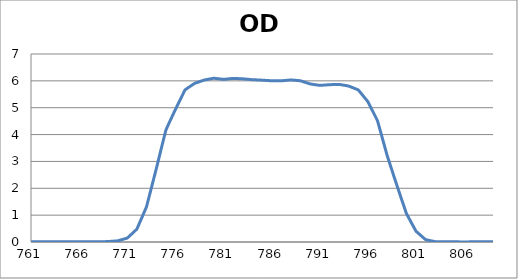
| Category | Series 0 |
|---|---|
| 2600.0 | 0.184 |
| 2599.0 | 0.183 |
| 2598.0 | 0.182 |
| 2597.0 | 0.182 |
| 2596.0 | 0.181 |
| 2595.0 | 0.18 |
| 2594.0 | 0.18 |
| 2593.0 | 0.18 |
| 2592.0 | 0.18 |
| 2591.0 | 0.18 |
| 2590.0 | 0.18 |
| 2589.0 | 0.18 |
| 2588.0 | 0.18 |
| 2587.0 | 0.181 |
| 2586.0 | 0.181 |
| 2585.0 | 0.182 |
| 2584.0 | 0.182 |
| 2583.0 | 0.182 |
| 2582.0 | 0.182 |
| 2581.0 | 0.182 |
| 2580.0 | 0.182 |
| 2579.0 | 0.181 |
| 2578.0 | 0.18 |
| 2577.0 | 0.18 |
| 2576.0 | 0.179 |
| 2575.0 | 0.178 |
| 2574.0 | 0.177 |
| 2573.0 | 0.175 |
| 2572.0 | 0.174 |
| 2571.0 | 0.172 |
| 2570.0 | 0.169 |
| 2569.0 | 0.167 |
| 2568.0 | 0.164 |
| 2567.0 | 0.161 |
| 2566.0 | 0.158 |
| 2565.0 | 0.155 |
| 2564.0 | 0.152 |
| 2563.0 | 0.149 |
| 2562.0 | 0.147 |
| 2561.0 | 0.145 |
| 2560.0 | 0.143 |
| 2559.0 | 0.141 |
| 2558.0 | 0.139 |
| 2557.0 | 0.138 |
| 2556.0 | 0.137 |
| 2555.0 | 0.137 |
| 2554.0 | 0.136 |
| 2553.0 | 0.136 |
| 2552.0 | 0.137 |
| 2551.0 | 0.138 |
| 2550.0 | 0.139 |
| 2549.0 | 0.141 |
| 2548.0 | 0.143 |
| 2547.0 | 0.145 |
| 2546.0 | 0.147 |
| 2545.0 | 0.15 |
| 2544.0 | 0.152 |
| 2543.0 | 0.155 |
| 2542.0 | 0.158 |
| 2541.0 | 0.161 |
| 2540.0 | 0.163 |
| 2539.0 | 0.166 |
| 2538.0 | 0.169 |
| 2537.0 | 0.171 |
| 2536.0 | 0.173 |
| 2535.0 | 0.175 |
| 2534.0 | 0.177 |
| 2533.0 | 0.178 |
| 2532.0 | 0.179 |
| 2531.0 | 0.18 |
| 2530.0 | 0.18 |
| 2529.0 | 0.18 |
| 2528.0 | 0.178 |
| 2527.0 | 0.177 |
| 2526.0 | 0.176 |
| 2525.0 | 0.174 |
| 2524.0 | 0.172 |
| 2523.0 | 0.169 |
| 2522.0 | 0.166 |
| 2521.0 | 0.163 |
| 2520.0 | 0.159 |
| 2519.0 | 0.155 |
| 2518.0 | 0.151 |
| 2517.0 | 0.147 |
| 2516.0 | 0.143 |
| 2515.0 | 0.139 |
| 2514.0 | 0.135 |
| 2513.0 | 0.132 |
| 2512.0 | 0.129 |
| 2511.0 | 0.126 |
| 2510.0 | 0.124 |
| 2509.0 | 0.122 |
| 2508.0 | 0.12 |
| 2507.0 | 0.119 |
| 2506.0 | 0.119 |
| 2505.0 | 0.119 |
| 2504.0 | 0.12 |
| 2503.0 | 0.121 |
| 2502.0 | 0.123 |
| 2501.0 | 0.125 |
| 2500.0 | 0.127 |
| 2499.0 | 0.13 |
| 2498.0 | 0.133 |
| 2497.0 | 0.137 |
| 2496.0 | 0.14 |
| 2495.0 | 0.144 |
| 2494.0 | 0.148 |
| 2493.0 | 0.151 |
| 2492.0 | 0.155 |
| 2491.0 | 0.159 |
| 2490.0 | 0.162 |
| 2489.0 | 0.164 |
| 2488.0 | 0.167 |
| 2487.0 | 0.17 |
| 2486.0 | 0.172 |
| 2485.0 | 0.173 |
| 2484.0 | 0.174 |
| 2483.0 | 0.175 |
| 2482.0 | 0.175 |
| 2481.0 | 0.175 |
| 2480.0 | 0.174 |
| 2479.0 | 0.173 |
| 2478.0 | 0.171 |
| 2477.0 | 0.169 |
| 2476.0 | 0.167 |
| 2475.0 | 0.164 |
| 2474.0 | 0.161 |
| 2473.0 | 0.157 |
| 2472.0 | 0.154 |
| 2471.0 | 0.15 |
| 2470.0 | 0.146 |
| 2469.0 | 0.143 |
| 2468.0 | 0.139 |
| 2467.0 | 0.135 |
| 2466.0 | 0.132 |
| 2465.0 | 0.128 |
| 2464.0 | 0.125 |
| 2463.0 | 0.122 |
| 2462.0 | 0.12 |
| 2461.0 | 0.118 |
| 2460.0 | 0.116 |
| 2459.0 | 0.115 |
| 2458.0 | 0.113 |
| 2457.0 | 0.113 |
| 2456.0 | 0.112 |
| 2455.0 | 0.112 |
| 2454.0 | 0.112 |
| 2453.0 | 0.113 |
| 2452.0 | 0.113 |
| 2451.0 | 0.114 |
| 2450.0 | 0.115 |
| 2449.0 | 0.116 |
| 2448.0 | 0.117 |
| 2447.0 | 0.118 |
| 2446.0 | 0.119 |
| 2445.0 | 0.12 |
| 2444.0 | 0.12 |
| 2443.0 | 0.121 |
| 2442.0 | 0.122 |
| 2441.0 | 0.123 |
| 2440.0 | 0.123 |
| 2439.0 | 0.124 |
| 2438.0 | 0.124 |
| 2437.0 | 0.124 |
| 2436.0 | 0.124 |
| 2435.0 | 0.124 |
| 2434.0 | 0.123 |
| 2433.0 | 0.123 |
| 2432.0 | 0.122 |
| 2431.0 | 0.121 |
| 2430.0 | 0.12 |
| 2429.0 | 0.12 |
| 2428.0 | 0.119 |
| 2427.0 | 0.118 |
| 2426.0 | 0.118 |
| 2425.0 | 0.117 |
| 2424.0 | 0.117 |
| 2423.0 | 0.117 |
| 2422.0 | 0.116 |
| 2421.0 | 0.116 |
| 2420.0 | 0.116 |
| 2419.0 | 0.116 |
| 2418.0 | 0.116 |
| 2417.0 | 0.116 |
| 2416.0 | 0.115 |
| 2415.0 | 0.115 |
| 2414.0 | 0.116 |
| 2413.0 | 0.116 |
| 2412.0 | 0.116 |
| 2411.0 | 0.116 |
| 2410.0 | 0.116 |
| 2409.0 | 0.116 |
| 2408.0 | 0.116 |
| 2407.0 | 0.116 |
| 2406.0 | 0.116 |
| 2405.0 | 0.116 |
| 2404.0 | 0.116 |
| 2403.0 | 0.116 |
| 2402.0 | 0.116 |
| 2401.0 | 0.116 |
| 2400.0 | 0.117 |
| 2399.0 | 0.117 |
| 2398.0 | 0.117 |
| 2397.0 | 0.118 |
| 2396.0 | 0.119 |
| 2395.0 | 0.12 |
| 2394.0 | 0.122 |
| 2393.0 | 0.123 |
| 2392.0 | 0.125 |
| 2391.0 | 0.127 |
| 2390.0 | 0.13 |
| 2389.0 | 0.132 |
| 2388.0 | 0.135 |
| 2387.0 | 0.139 |
| 2386.0 | 0.142 |
| 2385.0 | 0.145 |
| 2384.0 | 0.149 |
| 2383.0 | 0.152 |
| 2382.0 | 0.156 |
| 2381.0 | 0.159 |
| 2380.0 | 0.163 |
| 2379.0 | 0.166 |
| 2378.0 | 0.17 |
| 2377.0 | 0.172 |
| 2376.0 | 0.175 |
| 2375.0 | 0.177 |
| 2374.0 | 0.179 |
| 2373.0 | 0.181 |
| 2372.0 | 0.183 |
| 2371.0 | 0.184 |
| 2370.0 | 0.184 |
| 2369.0 | 0.184 |
| 2368.0 | 0.184 |
| 2367.0 | 0.183 |
| 2366.0 | 0.183 |
| 2365.0 | 0.181 |
| 2364.0 | 0.18 |
| 2363.0 | 0.178 |
| 2362.0 | 0.176 |
| 2361.0 | 0.174 |
| 2360.0 | 0.172 |
| 2359.0 | 0.169 |
| 2358.0 | 0.167 |
| 2357.0 | 0.165 |
| 2356.0 | 0.164 |
| 2355.0 | 0.162 |
| 2354.0 | 0.161 |
| 2353.0 | 0.16 |
| 2352.0 | 0.159 |
| 2351.0 | 0.159 |
| 2350.0 | 0.16 |
| 2349.0 | 0.16 |
| 2348.0 | 0.162 |
| 2347.0 | 0.163 |
| 2346.0 | 0.165 |
| 2345.0 | 0.167 |
| 2344.0 | 0.17 |
| 2343.0 | 0.173 |
| 2342.0 | 0.176 |
| 2341.0 | 0.179 |
| 2340.0 | 0.182 |
| 2339.0 | 0.185 |
| 2338.0 | 0.188 |
| 2337.0 | 0.191 |
| 2336.0 | 0.193 |
| 2335.0 | 0.196 |
| 2334.0 | 0.198 |
| 2333.0 | 0.2 |
| 2332.0 | 0.201 |
| 2331.0 | 0.202 |
| 2330.0 | 0.203 |
| 2329.0 | 0.203 |
| 2328.0 | 0.203 |
| 2327.0 | 0.203 |
| 2326.0 | 0.202 |
| 2325.0 | 0.201 |
| 2324.0 | 0.2 |
| 2323.0 | 0.198 |
| 2322.0 | 0.196 |
| 2321.0 | 0.194 |
| 2320.0 | 0.192 |
| 2319.0 | 0.19 |
| 2318.0 | 0.188 |
| 2317.0 | 0.186 |
| 2316.0 | 0.184 |
| 2315.0 | 0.183 |
| 2314.0 | 0.181 |
| 2313.0 | 0.18 |
| 2312.0 | 0.179 |
| 2311.0 | 0.178 |
| 2310.0 | 0.178 |
| 2309.0 | 0.178 |
| 2308.0 | 0.178 |
| 2307.0 | 0.179 |
| 2306.0 | 0.179 |
| 2305.0 | 0.18 |
| 2304.0 | 0.181 |
| 2303.0 | 0.182 |
| 2302.0 | 0.183 |
| 2301.0 | 0.184 |
| 2300.0 | 0.185 |
| 2299.0 | 0.186 |
| 2298.0 | 0.187 |
| 2297.0 | 0.187 |
| 2296.0 | 0.188 |
| 2295.0 | 0.188 |
| 2294.0 | 0.188 |
| 2293.0 | 0.188 |
| 2292.0 | 0.188 |
| 2291.0 | 0.188 |
| 2290.0 | 0.187 |
| 2289.0 | 0.187 |
| 2288.0 | 0.186 |
| 2287.0 | 0.186 |
| 2286.0 | 0.186 |
| 2285.0 | 0.186 |
| 2284.0 | 0.186 |
| 2283.0 | 0.186 |
| 2282.0 | 0.186 |
| 2281.0 | 0.187 |
| 2280.0 | 0.188 |
| 2279.0 | 0.19 |
| 2278.0 | 0.191 |
| 2277.0 | 0.193 |
| 2276.0 | 0.196 |
| 2275.0 | 0.198 |
| 2274.0 | 0.201 |
| 2273.0 | 0.204 |
| 2272.0 | 0.208 |
| 2271.0 | 0.211 |
| 2270.0 | 0.214 |
| 2269.0 | 0.217 |
| 2268.0 | 0.219 |
| 2267.0 | 0.222 |
| 2266.0 | 0.224 |
| 2265.0 | 0.226 |
| 2264.0 | 0.227 |
| 2263.0 | 0.228 |
| 2262.0 | 0.229 |
| 2261.0 | 0.229 |
| 2260.0 | 0.229 |
| 2259.0 | 0.229 |
| 2258.0 | 0.229 |
| 2257.0 | 0.228 |
| 2256.0 | 0.227 |
| 2255.0 | 0.226 |
| 2254.0 | 0.226 |
| 2253.0 | 0.226 |
| 2252.0 | 0.226 |
| 2251.0 | 0.226 |
| 2250.0 | 0.227 |
| 2249.0 | 0.228 |
| 2248.0 | 0.23 |
| 2247.0 | 0.232 |
| 2246.0 | 0.235 |
| 2245.0 | 0.239 |
| 2244.0 | 0.244 |
| 2243.0 | 0.249 |
| 2242.0 | 0.255 |
| 2241.0 | 0.261 |
| 2240.0 | 0.268 |
| 2239.0 | 0.275 |
| 2238.0 | 0.283 |
| 2237.0 | 0.29 |
| 2236.0 | 0.298 |
| 2235.0 | 0.305 |
| 2234.0 | 0.312 |
| 2233.0 | 0.318 |
| 2232.0 | 0.324 |
| 2231.0 | 0.329 |
| 2230.0 | 0.334 |
| 2229.0 | 0.337 |
| 2228.0 | 0.34 |
| 2227.0 | 0.342 |
| 2226.0 | 0.343 |
| 2225.0 | 0.344 |
| 2224.0 | 0.343 |
| 2223.0 | 0.342 |
| 2222.0 | 0.339 |
| 2221.0 | 0.336 |
| 2220.0 | 0.333 |
| 2219.0 | 0.329 |
| 2218.0 | 0.325 |
| 2217.0 | 0.321 |
| 2216.0 | 0.316 |
| 2215.0 | 0.312 |
| 2214.0 | 0.308 |
| 2213.0 | 0.304 |
| 2212.0 | 0.3 |
| 2211.0 | 0.297 |
| 2210.0 | 0.295 |
| 2209.0 | 0.293 |
| 2208.0 | 0.292 |
| 2207.0 | 0.291 |
| 2206.0 | 0.291 |
| 2205.0 | 0.291 |
| 2204.0 | 0.291 |
| 2203.0 | 0.293 |
| 2202.0 | 0.294 |
| 2201.0 | 0.296 |
| 2200.0 | 0.297 |
| 2199.0 | 0.299 |
| 2198.0 | 0.3 |
| 2197.0 | 0.301 |
| 2196.0 | 0.302 |
| 2195.0 | 0.302 |
| 2194.0 | 0.302 |
| 2193.0 | 0.302 |
| 2192.0 | 0.301 |
| 2191.0 | 0.3 |
| 2190.0 | 0.297 |
| 2189.0 | 0.295 |
| 2188.0 | 0.292 |
| 2187.0 | 0.288 |
| 2186.0 | 0.284 |
| 2185.0 | 0.28 |
| 2184.0 | 0.275 |
| 2183.0 | 0.27 |
| 2182.0 | 0.266 |
| 2181.0 | 0.261 |
| 2180.0 | 0.257 |
| 2179.0 | 0.253 |
| 2178.0 | 0.249 |
| 2177.0 | 0.245 |
| 2176.0 | 0.243 |
| 2175.0 | 0.241 |
| 2174.0 | 0.239 |
| 2173.0 | 0.238 |
| 2172.0 | 0.237 |
| 2171.0 | 0.238 |
| 2170.0 | 0.238 |
| 2169.0 | 0.239 |
| 2168.0 | 0.24 |
| 2167.0 | 0.241 |
| 2166.0 | 0.242 |
| 2165.0 | 0.244 |
| 2164.0 | 0.245 |
| 2163.0 | 0.246 |
| 2162.0 | 0.247 |
| 2161.0 | 0.247 |
| 2160.0 | 0.247 |
| 2159.0 | 0.247 |
| 2158.0 | 0.246 |
| 2157.0 | 0.245 |
| 2156.0 | 0.243 |
| 2155.0 | 0.241 |
| 2154.0 | 0.239 |
| 2153.0 | 0.237 |
| 2152.0 | 0.234 |
| 2151.0 | 0.232 |
| 2150.0 | 0.23 |
| 2149.0 | 0.228 |
| 2148.0 | 0.226 |
| 2147.0 | 0.225 |
| 2146.0 | 0.224 |
| 2145.0 | 0.224 |
| 2144.0 | 0.224 |
| 2143.0 | 0.225 |
| 2142.0 | 0.226 |
| 2141.0 | 0.228 |
| 2140.0 | 0.23 |
| 2139.0 | 0.232 |
| 2138.0 | 0.235 |
| 2137.0 | 0.237 |
| 2136.0 | 0.239 |
| 2135.0 | 0.242 |
| 2134.0 | 0.244 |
| 2133.0 | 0.245 |
| 2132.0 | 0.246 |
| 2131.0 | 0.247 |
| 2130.0 | 0.248 |
| 2129.0 | 0.248 |
| 2128.0 | 0.247 |
| 2127.0 | 0.246 |
| 2126.0 | 0.245 |
| 2125.0 | 0.244 |
| 2124.0 | 0.242 |
| 2123.0 | 0.24 |
| 2122.0 | 0.239 |
| 2121.0 | 0.237 |
| 2120.0 | 0.237 |
| 2119.0 | 0.236 |
| 2118.0 | 0.237 |
| 2117.0 | 0.238 |
| 2116.0 | 0.24 |
| 2115.0 | 0.243 |
| 2114.0 | 0.247 |
| 2113.0 | 0.252 |
| 2112.0 | 0.258 |
| 2111.0 | 0.264 |
| 2110.0 | 0.271 |
| 2109.0 | 0.278 |
| 2108.0 | 0.286 |
| 2107.0 | 0.294 |
| 2106.0 | 0.301 |
| 2105.0 | 0.308 |
| 2104.0 | 0.315 |
| 2103.0 | 0.321 |
| 2102.0 | 0.326 |
| 2101.0 | 0.33 |
| 2100.0 | 0.334 |
| 2099.0 | 0.336 |
| 2098.0 | 0.337 |
| 2097.0 | 0.337 |
| 2096.0 | 0.337 |
| 2095.0 | 0.336 |
| 2094.0 | 0.334 |
| 2093.0 | 0.331 |
| 2092.0 | 0.328 |
| 2091.0 | 0.324 |
| 2090.0 | 0.32 |
| 2089.0 | 0.317 |
| 2088.0 | 0.314 |
| 2087.0 | 0.311 |
| 2086.0 | 0.308 |
| 2085.0 | 0.307 |
| 2084.0 | 0.306 |
| 2083.0 | 0.306 |
| 2082.0 | 0.308 |
| 2081.0 | 0.31 |
| 2080.0 | 0.313 |
| 2079.0 | 0.317 |
| 2078.0 | 0.322 |
| 2077.0 | 0.327 |
| 2076.0 | 0.333 |
| 2075.0 | 0.339 |
| 2074.0 | 0.346 |
| 2073.0 | 0.352 |
| 2072.0 | 0.358 |
| 2071.0 | 0.363 |
| 2070.0 | 0.368 |
| 2069.0 | 0.373 |
| 2068.0 | 0.376 |
| 2067.0 | 0.379 |
| 2066.0 | 0.381 |
| 2065.0 | 0.382 |
| 2064.0 | 0.383 |
| 2063.0 | 0.383 |
| 2062.0 | 0.383 |
| 2061.0 | 0.381 |
| 2060.0 | 0.38 |
| 2059.0 | 0.379 |
| 2058.0 | 0.378 |
| 2057.0 | 0.376 |
| 2056.0 | 0.375 |
| 2055.0 | 0.374 |
| 2054.0 | 0.373 |
| 2053.0 | 0.373 |
| 2052.0 | 0.373 |
| 2051.0 | 0.373 |
| 2050.0 | 0.374 |
| 2049.0 | 0.375 |
| 2048.0 | 0.376 |
| 2047.0 | 0.377 |
| 2046.0 | 0.377 |
| 2045.0 | 0.378 |
| 2044.0 | 0.379 |
| 2043.0 | 0.379 |
| 2042.0 | 0.379 |
| 2041.0 | 0.378 |
| 2040.0 | 0.377 |
| 2039.0 | 0.375 |
| 2038.0 | 0.372 |
| 2037.0 | 0.368 |
| 2036.0 | 0.364 |
| 2035.0 | 0.36 |
| 2034.0 | 0.356 |
| 2033.0 | 0.351 |
| 2032.0 | 0.346 |
| 2031.0 | 0.341 |
| 2030.0 | 0.337 |
| 2029.0 | 0.332 |
| 2028.0 | 0.329 |
| 2027.0 | 0.327 |
| 2026.0 | 0.325 |
| 2025.0 | 0.324 |
| 2024.0 | 0.324 |
| 2023.0 | 0.325 |
| 2022.0 | 0.326 |
| 2021.0 | 0.329 |
| 2020.0 | 0.331 |
| 2019.0 | 0.334 |
| 2018.0 | 0.337 |
| 2017.0 | 0.34 |
| 2016.0 | 0.342 |
| 2015.0 | 0.344 |
| 2014.0 | 0.345 |
| 2013.0 | 0.346 |
| 2012.0 | 0.346 |
| 2011.0 | 0.345 |
| 2010.0 | 0.343 |
| 2009.0 | 0.341 |
| 2008.0 | 0.338 |
| 2007.0 | 0.333 |
| 2006.0 | 0.329 |
| 2005.0 | 0.323 |
| 2004.0 | 0.318 |
| 2003.0 | 0.312 |
| 2002.0 | 0.307 |
| 2001.0 | 0.301 |
| 2000.0 | 0.297 |
| 1999.0 | 0.293 |
| 1998.0 | 0.289 |
| 1997.0 | 0.287 |
| 1996.0 | 0.286 |
| 1995.0 | 0.287 |
| 1994.0 | 0.288 |
| 1993.0 | 0.29 |
| 1992.0 | 0.292 |
| 1991.0 | 0.295 |
| 1990.0 | 0.299 |
| 1989.0 | 0.302 |
| 1988.0 | 0.305 |
| 1987.0 | 0.308 |
| 1986.0 | 0.311 |
| 1985.0 | 0.313 |
| 1984.0 | 0.313 |
| 1983.0 | 0.314 |
| 1982.0 | 0.313 |
| 1981.0 | 0.311 |
| 1980.0 | 0.309 |
| 1979.0 | 0.306 |
| 1978.0 | 0.302 |
| 1977.0 | 0.298 |
| 1976.0 | 0.294 |
| 1975.0 | 0.29 |
| 1974.0 | 0.287 |
| 1973.0 | 0.284 |
| 1972.0 | 0.282 |
| 1971.0 | 0.28 |
| 1970.0 | 0.279 |
| 1969.0 | 0.28 |
| 1968.0 | 0.281 |
| 1967.0 | 0.283 |
| 1966.0 | 0.286 |
| 1965.0 | 0.289 |
| 1964.0 | 0.293 |
| 1963.0 | 0.297 |
| 1962.0 | 0.301 |
| 1961.0 | 0.306 |
| 1960.0 | 0.31 |
| 1959.0 | 0.313 |
| 1958.0 | 0.316 |
| 1957.0 | 0.318 |
| 1956.0 | 0.319 |
| 1955.0 | 0.319 |
| 1954.0 | 0.319 |
| 1953.0 | 0.318 |
| 1952.0 | 0.317 |
| 1951.0 | 0.315 |
| 1950.0 | 0.312 |
| 1949.0 | 0.31 |
| 1948.0 | 0.307 |
| 1947.0 | 0.306 |
| 1946.0 | 0.304 |
| 1945.0 | 0.304 |
| 1944.0 | 0.304 |
| 1943.0 | 0.304 |
| 1942.0 | 0.305 |
| 1941.0 | 0.307 |
| 1940.0 | 0.31 |
| 1939.0 | 0.313 |
| 1938.0 | 0.317 |
| 1937.0 | 0.321 |
| 1936.0 | 0.324 |
| 1935.0 | 0.327 |
| 1934.0 | 0.33 |
| 1933.0 | 0.332 |
| 1932.0 | 0.334 |
| 1931.0 | 0.334 |
| 1930.0 | 0.335 |
| 1929.0 | 0.334 |
| 1928.0 | 0.333 |
| 1927.0 | 0.331 |
| 1926.0 | 0.328 |
| 1925.0 | 0.324 |
| 1924.0 | 0.321 |
| 1923.0 | 0.316 |
| 1922.0 | 0.312 |
| 1921.0 | 0.308 |
| 1920.0 | 0.304 |
| 1919.0 | 0.301 |
| 1918.0 | 0.298 |
| 1917.0 | 0.295 |
| 1916.0 | 0.292 |
| 1915.0 | 0.291 |
| 1914.0 | 0.29 |
| 1913.0 | 0.29 |
| 1912.0 | 0.29 |
| 1911.0 | 0.291 |
| 1910.0 | 0.291 |
| 1909.0 | 0.29 |
| 1908.0 | 0.289 |
| 1907.0 | 0.289 |
| 1906.0 | 0.289 |
| 1905.0 | 0.288 |
| 1904.0 | 0.287 |
| 1903.0 | 0.286 |
| 1902.0 | 0.284 |
| 1901.0 | 0.281 |
| 1900.0 | 0.279 |
| 1899.0 | 0.276 |
| 1898.0 | 0.274 |
| 1897.0 | 0.272 |
| 1896.0 | 0.27 |
| 1895.0 | 0.268 |
| 1894.0 | 0.267 |
| 1893.0 | 0.266 |
| 1892.0 | 0.266 |
| 1891.0 | 0.267 |
| 1890.0 | 0.268 |
| 1889.0 | 0.269 |
| 1888.0 | 0.27 |
| 1887.0 | 0.27 |
| 1886.0 | 0.271 |
| 1885.0 | 0.272 |
| 1884.0 | 0.273 |
| 1883.0 | 0.273 |
| 1882.0 | 0.273 |
| 1881.0 | 0.273 |
| 1880.0 | 0.272 |
| 1879.0 | 0.27 |
| 1878.0 | 0.269 |
| 1877.0 | 0.267 |
| 1876.0 | 0.266 |
| 1875.0 | 0.265 |
| 1874.0 | 0.265 |
| 1873.0 | 0.265 |
| 1872.0 | 0.266 |
| 1871.0 | 0.267 |
| 1870.0 | 0.268 |
| 1869.0 | 0.271 |
| 1868.0 | 0.273 |
| 1867.0 | 0.275 |
| 1866.0 | 0.278 |
| 1865.0 | 0.28 |
| 1864.0 | 0.282 |
| 1863.0 | 0.284 |
| 1862.0 | 0.286 |
| 1861.0 | 0.288 |
| 1860.0 | 0.29 |
| 1859.0 | 0.292 |
| 1858.0 | 0.292 |
| 1857.0 | 0.291 |
| 1856.0 | 0.29 |
| 1855.0 | 0.288 |
| 1854.0 | 0.286 |
| 1853.0 | 0.284 |
| 1852.0 | 0.283 |
| 1851.0 | 0.281 |
| 1850.0 | 0.278 |
| 1849.0 | 0.277 |
| 1848.0 | 0.276 |
| 1847.0 | 0.278 |
| 1846.0 | 0.28 |
| 1845.0 | 0.281 |
| 1844.0 | 0.281 |
| 1843.0 | 0.282 |
| 1842.0 | 0.283 |
| 1841.0 | 0.287 |
| 1840.0 | 0.29 |
| 1839.0 | 0.294 |
| 1838.0 | 0.295 |
| 1837.0 | 0.296 |
| 1836.0 | 0.296 |
| 1835.0 | 0.296 |
| 1834.0 | 0.295 |
| 1833.0 | 0.293 |
| 1832.0 | 0.289 |
| 1831.0 | 0.285 |
| 1830.0 | 0.282 |
| 1829.0 | 0.278 |
| 1828.0 | 0.274 |
| 1827.0 | 0.269 |
| 1826.0 | 0.264 |
| 1825.0 | 0.26 |
| 1824.0 | 0.256 |
| 1823.0 | 0.253 |
| 1822.0 | 0.25 |
| 1821.0 | 0.248 |
| 1820.0 | 0.246 |
| 1819.0 | 0.245 |
| 1818.0 | 0.245 |
| 1817.0 | 0.243 |
| 1816.0 | 0.242 |
| 1815.0 | 0.242 |
| 1814.0 | 0.242 |
| 1813.0 | 0.241 |
| 1812.0 | 0.241 |
| 1811.0 | 0.241 |
| 1810.0 | 0.24 |
| 1809.0 | 0.24 |
| 1808.0 | 0.239 |
| 1807.0 | 0.238 |
| 1806.0 | 0.238 |
| 1805.0 | 0.238 |
| 1804.0 | 0.238 |
| 1803.0 | 0.238 |
| 1802.0 | 0.238 |
| 1801.0 | 0.238 |
| 1800.0 | 0.239 |
| 1799.0 | 0.239 |
| 1798.0 | 0.24 |
| 1797.0 | 0.24 |
| 1796.0 | 0.239 |
| 1795.0 | 0.239 |
| 1794.0 | 0.238 |
| 1793.0 | 0.237 |
| 1792.0 | 0.236 |
| 1791.0 | 0.235 |
| 1790.0 | 0.234 |
| 1789.0 | 0.233 |
| 1788.0 | 0.232 |
| 1787.0 | 0.231 |
| 1786.0 | 0.231 |
| 1785.0 | 0.232 |
| 1784.0 | 0.233 |
| 1783.0 | 0.235 |
| 1782.0 | 0.238 |
| 1781.0 | 0.241 |
| 1780.0 | 0.244 |
| 1779.0 | 0.248 |
| 1778.0 | 0.251 |
| 1777.0 | 0.254 |
| 1776.0 | 0.257 |
| 1775.0 | 0.259 |
| 1774.0 | 0.261 |
| 1773.0 | 0.262 |
| 1772.0 | 0.262 |
| 1771.0 | 0.262 |
| 1770.0 | 0.261 |
| 1769.0 | 0.259 |
| 1768.0 | 0.257 |
| 1767.0 | 0.256 |
| 1766.0 | 0.254 |
| 1765.0 | 0.254 |
| 1764.0 | 0.253 |
| 1763.0 | 0.254 |
| 1762.0 | 0.255 |
| 1761.0 | 0.258 |
| 1760.0 | 0.261 |
| 1759.0 | 0.265 |
| 1758.0 | 0.269 |
| 1757.0 | 0.273 |
| 1756.0 | 0.277 |
| 1755.0 | 0.281 |
| 1754.0 | 0.285 |
| 1753.0 | 0.287 |
| 1752.0 | 0.288 |
| 1751.0 | 0.288 |
| 1750.0 | 0.288 |
| 1749.0 | 0.286 |
| 1748.0 | 0.283 |
| 1747.0 | 0.279 |
| 1746.0 | 0.275 |
| 1745.0 | 0.271 |
| 1744.0 | 0.268 |
| 1743.0 | 0.264 |
| 1742.0 | 0.261 |
| 1741.0 | 0.259 |
| 1740.0 | 0.258 |
| 1739.0 | 0.258 |
| 1738.0 | 0.258 |
| 1737.0 | 0.258 |
| 1736.0 | 0.259 |
| 1735.0 | 0.259 |
| 1734.0 | 0.259 |
| 1733.0 | 0.259 |
| 1732.0 | 0.258 |
| 1731.0 | 0.256 |
| 1730.0 | 0.252 |
| 1729.0 | 0.248 |
| 1728.0 | 0.244 |
| 1727.0 | 0.238 |
| 1726.0 | 0.233 |
| 1725.0 | 0.227 |
| 1724.0 | 0.222 |
| 1723.0 | 0.217 |
| 1722.0 | 0.213 |
| 1721.0 | 0.21 |
| 1720.0 | 0.208 |
| 1719.0 | 0.206 |
| 1718.0 | 0.206 |
| 1717.0 | 0.206 |
| 1716.0 | 0.206 |
| 1715.0 | 0.206 |
| 1714.0 | 0.206 |
| 1713.0 | 0.205 |
| 1712.0 | 0.202 |
| 1711.0 | 0.199 |
| 1710.0 | 0.196 |
| 1709.0 | 0.191 |
| 1708.0 | 0.187 |
| 1707.0 | 0.182 |
| 1706.0 | 0.179 |
| 1705.0 | 0.177 |
| 1704.0 | 0.176 |
| 1703.0 | 0.178 |
| 1702.0 | 0.182 |
| 1701.0 | 0.188 |
| 1700.0 | 0.195 |
| 1699.0 | 0.203 |
| 1698.0 | 0.212 |
| 1697.0 | 0.221 |
| 1696.0 | 0.23 |
| 1695.0 | 0.237 |
| 1694.0 | 0.242 |
| 1693.0 | 0.244 |
| 1692.0 | 0.245 |
| 1691.0 | 0.243 |
| 1690.0 | 0.238 |
| 1689.0 | 0.231 |
| 1688.0 | 0.223 |
| 1687.0 | 0.215 |
| 1686.0 | 0.206 |
| 1685.0 | 0.198 |
| 1684.0 | 0.193 |
| 1683.0 | 0.19 |
| 1682.0 | 0.19 |
| 1681.0 | 0.194 |
| 1680.0 | 0.202 |
| 1679.0 | 0.213 |
| 1678.0 | 0.225 |
| 1677.0 | 0.239 |
| 1676.0 | 0.254 |
| 1675.0 | 0.268 |
| 1674.0 | 0.28 |
| 1673.0 | 0.289 |
| 1672.0 | 0.295 |
| 1671.0 | 0.299 |
| 1670.0 | 0.298 |
| 1669.0 | 0.295 |
| 1668.0 | 0.289 |
| 1667.0 | 0.28 |
| 1666.0 | 0.271 |
| 1665.0 | 0.261 |
| 1664.0 | 0.251 |
| 1663.0 | 0.243 |
| 1662.0 | 0.236 |
| 1661.0 | 0.231 |
| 1660.0 | 0.229 |
| 1659.0 | 0.229 |
| 1658.0 | 0.231 |
| 1657.0 | 0.234 |
| 1656.0 | 0.238 |
| 1655.0 | 0.24 |
| 1654.0 | 0.242 |
| 1653.0 | 0.242 |
| 1652.0 | 0.24 |
| 1651.0 | 0.236 |
| 1650.0 | 0.229 |
| 1649.0 | 0.22 |
| 1648.0 | 0.209 |
| 1647.0 | 0.197 |
| 1646.0 | 0.184 |
| 1645.0 | 0.171 |
| 1644.0 | 0.16 |
| 1643.0 | 0.15 |
| 1642.0 | 0.141 |
| 1641.0 | 0.135 |
| 1640.0 | 0.132 |
| 1639.0 | 0.131 |
| 1638.0 | 0.131 |
| 1637.0 | 0.132 |
| 1636.0 | 0.134 |
| 1635.0 | 0.135 |
| 1634.0 | 0.135 |
| 1633.0 | 0.134 |
| 1632.0 | 0.132 |
| 1631.0 | 0.13 |
| 1630.0 | 0.127 |
| 1629.0 | 0.125 |
| 1628.0 | 0.124 |
| 1627.0 | 0.125 |
| 1626.0 | 0.129 |
| 1625.0 | 0.135 |
| 1624.0 | 0.144 |
| 1623.0 | 0.155 |
| 1622.0 | 0.168 |
| 1621.0 | 0.182 |
| 1620.0 | 0.197 |
| 1619.0 | 0.212 |
| 1618.0 | 0.226 |
| 1617.0 | 0.239 |
| 1616.0 | 0.25 |
| 1615.0 | 0.26 |
| 1614.0 | 0.27 |
| 1613.0 | 0.278 |
| 1612.0 | 0.285 |
| 1611.0 | 0.292 |
| 1610.0 | 0.298 |
| 1609.0 | 0.304 |
| 1608.0 | 0.309 |
| 1607.0 | 0.314 |
| 1606.0 | 0.319 |
| 1605.0 | 0.322 |
| 1604.0 | 0.323 |
| 1603.0 | 0.324 |
| 1602.0 | 0.322 |
| 1601.0 | 0.319 |
| 1600.0 | 0.313 |
| 1599.0 | 0.307 |
| 1598.0 | 0.3 |
| 1597.0 | 0.293 |
| 1596.0 | 0.288 |
| 1595.0 | 0.285 |
| 1594.0 | 0.285 |
| 1593.0 | 0.289 |
| 1592.0 | 0.298 |
| 1591.0 | 0.31 |
| 1590.0 | 0.324 |
| 1589.0 | 0.34 |
| 1588.0 | 0.356 |
| 1587.0 | 0.37 |
| 1586.0 | 0.381 |
| 1585.0 | 0.388 |
| 1584.0 | 0.391 |
| 1583.0 | 0.388 |
| 1582.0 | 0.378 |
| 1581.0 | 0.364 |
| 1580.0 | 0.345 |
| 1579.0 | 0.323 |
| 1578.0 | 0.298 |
| 1577.0 | 0.274 |
| 1576.0 | 0.251 |
| 1575.0 | 0.233 |
| 1574.0 | 0.219 |
| 1573.0 | 0.213 |
| 1572.0 | 0.213 |
| 1571.0 | 0.219 |
| 1570.0 | 0.229 |
| 1569.0 | 0.241 |
| 1568.0 | 0.254 |
| 1567.0 | 0.264 |
| 1566.0 | 0.27 |
| 1565.0 | 0.271 |
| 1564.0 | 0.266 |
| 1563.0 | 0.254 |
| 1562.0 | 0.236 |
| 1561.0 | 0.213 |
| 1560.0 | 0.186 |
| 1559.0 | 0.158 |
| 1558.0 | 0.132 |
| 1557.0 | 0.109 |
| 1556.0 | 0.093 |
| 1555.0 | 0.084 |
| 1554.0 | 0.083 |
| 1553.0 | 0.087 |
| 1552.0 | 0.096 |
| 1551.0 | 0.105 |
| 1550.0 | 0.114 |
| 1549.0 | 0.119 |
| 1548.0 | 0.12 |
| 1547.0 | 0.116 |
| 1546.0 | 0.107 |
| 1545.0 | 0.095 |
| 1544.0 | 0.081 |
| 1543.0 | 0.069 |
| 1542.0 | 0.061 |
| 1541.0 | 0.058 |
| 1540.0 | 0.063 |
| 1539.0 | 0.074 |
| 1538.0 | 0.09 |
| 1537.0 | 0.11 |
| 1536.0 | 0.13 |
| 1535.0 | 0.15 |
| 1534.0 | 0.166 |
| 1533.0 | 0.177 |
| 1532.0 | 0.182 |
| 1531.0 | 0.18 |
| 1530.0 | 0.173 |
| 1529.0 | 0.162 |
| 1528.0 | 0.148 |
| 1527.0 | 0.135 |
| 1526.0 | 0.124 |
| 1525.0 | 0.119 |
| 1524.0 | 0.122 |
| 1523.0 | 0.132 |
| 1522.0 | 0.15 |
| 1521.0 | 0.172 |
| 1520.0 | 0.199 |
| 1519.0 | 0.223 |
| 1518.0 | 0.244 |
| 1517.0 | 0.26 |
| 1516.0 | 0.269 |
| 1515.0 | 0.27 |
| 1514.0 | 0.264 |
| 1513.0 | 0.252 |
| 1512.0 | 0.235 |
| 1511.0 | 0.216 |
| 1510.0 | 0.197 |
| 1509.0 | 0.182 |
| 1508.0 | 0.171 |
| 1507.0 | 0.168 |
| 1506.0 | 0.171 |
| 1505.0 | 0.178 |
| 1504.0 | 0.188 |
| 1503.0 | 0.198 |
| 1502.0 | 0.206 |
| 1501.0 | 0.207 |
| 1500.0 | 0.203 |
| 1499.0 | 0.193 |
| 1498.0 | 0.177 |
| 1497.0 | 0.155 |
| 1496.0 | 0.13 |
| 1495.0 | 0.106 |
| 1494.0 | 0.085 |
| 1493.0 | 0.069 |
| 1492.0 | 0.061 |
| 1491.0 | 0.062 |
| 1490.0 | 0.071 |
| 1489.0 | 0.085 |
| 1488.0 | 0.103 |
| 1487.0 | 0.118 |
| 1486.0 | 0.131 |
| 1485.0 | 0.139 |
| 1484.0 | 0.14 |
| 1483.0 | 0.136 |
| 1482.0 | 0.127 |
| 1481.0 | 0.116 |
| 1480.0 | 0.105 |
| 1479.0 | 0.098 |
| 1478.0 | 0.097 |
| 1477.0 | 0.104 |
| 1476.0 | 0.119 |
| 1475.0 | 0.139 |
| 1474.0 | 0.163 |
| 1473.0 | 0.185 |
| 1472.0 | 0.205 |
| 1471.0 | 0.219 |
| 1470.0 | 0.228 |
| 1469.0 | 0.229 |
| 1468.0 | 0.225 |
| 1467.0 | 0.216 |
| 1466.0 | 0.206 |
| 1465.0 | 0.198 |
| 1464.0 | 0.194 |
| 1463.0 | 0.196 |
| 1462.0 | 0.205 |
| 1461.0 | 0.22 |
| 1460.0 | 0.24 |
| 1459.0 | 0.262 |
| 1458.0 | 0.281 |
| 1457.0 | 0.297 |
| 1456.0 | 0.309 |
| 1455.0 | 0.314 |
| 1454.0 | 0.313 |
| 1453.0 | 0.305 |
| 1452.0 | 0.294 |
| 1451.0 | 0.279 |
| 1450.0 | 0.264 |
| 1449.0 | 0.251 |
| 1448.0 | 0.242 |
| 1447.0 | 0.238 |
| 1446.0 | 0.239 |
| 1445.0 | 0.245 |
| 1444.0 | 0.252 |
| 1443.0 | 0.26 |
| 1442.0 | 0.265 |
| 1441.0 | 0.265 |
| 1440.0 | 0.26 |
| 1439.0 | 0.248 |
| 1438.0 | 0.232 |
| 1437.0 | 0.212 |
| 1436.0 | 0.19 |
| 1435.0 | 0.171 |
| 1434.0 | 0.153 |
| 1433.0 | 0.141 |
| 1432.0 | 0.133 |
| 1431.0 | 0.13 |
| 1430.0 | 0.129 |
| 1429.0 | 0.128 |
| 1428.0 | 0.125 |
| 1427.0 | 0.118 |
| 1426.0 | 0.108 |
| 1425.0 | 0.096 |
| 1424.0 | 0.082 |
| 1423.0 | 0.07 |
| 1422.0 | 0.063 |
| 1421.0 | 0.061 |
| 1420.0 | 0.065 |
| 1419.0 | 0.075 |
| 1418.0 | 0.088 |
| 1417.0 | 0.099 |
| 1416.0 | 0.109 |
| 1415.0 | 0.113 |
| 1414.0 | 0.111 |
| 1413.0 | 0.103 |
| 1412.0 | 0.093 |
| 1411.0 | 0.081 |
| 1410.0 | 0.072 |
| 1409.0 | 0.072 |
| 1408.0 | 0.081 |
| 1407.0 | 0.101 |
| 1406.0 | 0.129 |
| 1405.0 | 0.164 |
| 1404.0 | 0.202 |
| 1403.0 | 0.235 |
| 1402.0 | 0.26 |
| 1401.0 | 0.274 |
| 1400.0 | 0.28 |
| 1399.0 | 0.278 |
| 1398.0 | 0.269 |
| 1397.0 | 0.257 |
| 1396.0 | 0.248 |
| 1395.0 | 0.249 |
| 1394.0 | 0.262 |
| 1393.0 | 0.284 |
| 1392.0 | 0.32 |
| 1391.0 | 0.359 |
| 1390.0 | 0.394 |
| 1389.0 | 0.423 |
| 1388.0 | 0.444 |
| 1387.0 | 0.455 |
| 1386.0 | 0.45 |
| 1385.0 | 0.432 |
| 1384.0 | 0.401 |
| 1383.0 | 0.36 |
| 1382.0 | 0.315 |
| 1381.0 | 0.276 |
| 1380.0 | 0.247 |
| 1379.0 | 0.23 |
| 1378.0 | 0.23 |
| 1377.0 | 0.242 |
| 1376.0 | 0.263 |
| 1375.0 | 0.286 |
| 1374.0 | 0.308 |
| 1373.0 | 0.321 |
| 1372.0 | 0.323 |
| 1371.0 | 0.313 |
| 1370.0 | 0.292 |
| 1369.0 | 0.262 |
| 1368.0 | 0.223 |
| 1367.0 | 0.18 |
| 1366.0 | 0.142 |
| 1365.0 | 0.11 |
| 1364.0 | 0.088 |
| 1363.0 | 0.078 |
| 1362.0 | 0.081 |
| 1361.0 | 0.09 |
| 1360.0 | 0.102 |
| 1359.0 | 0.113 |
| 1358.0 | 0.119 |
| 1357.0 | 0.121 |
| 1356.0 | 0.117 |
| 1355.0 | 0.11 |
| 1354.0 | 0.101 |
| 1353.0 | 0.09 |
| 1352.0 | 0.077 |
| 1351.0 | 0.064 |
| 1350.0 | 0.052 |
| 1349.0 | 0.043 |
| 1348.0 | 0.037 |
| 1347.0 | 0.039 |
| 1346.0 | 0.048 |
| 1345.0 | 0.068 |
| 1344.0 | 0.096 |
| 1343.0 | 0.129 |
| 1342.0 | 0.166 |
| 1341.0 | 0.199 |
| 1340.0 | 0.224 |
| 1339.0 | 0.239 |
| 1338.0 | 0.242 |
| 1337.0 | 0.231 |
| 1336.0 | 0.209 |
| 1335.0 | 0.18 |
| 1334.0 | 0.149 |
| 1333.0 | 0.126 |
| 1332.0 | 0.118 |
| 1331.0 | 0.13 |
| 1330.0 | 0.16 |
| 1329.0 | 0.204 |
| 1328.0 | 0.254 |
| 1327.0 | 0.3 |
| 1326.0 | 0.335 |
| 1325.0 | 0.354 |
| 1324.0 | 0.353 |
| 1323.0 | 0.333 |
| 1322.0 | 0.294 |
| 1321.0 | 0.243 |
| 1320.0 | 0.187 |
| 1319.0 | 0.14 |
| 1318.0 | 0.111 |
| 1317.0 | 0.109 |
| 1316.0 | 0.131 |
| 1315.0 | 0.169 |
| 1314.0 | 0.21 |
| 1313.0 | 0.242 |
| 1312.0 | 0.257 |
| 1311.0 | 0.252 |
| 1310.0 | 0.226 |
| 1309.0 | 0.184 |
| 1308.0 | 0.131 |
| 1307.0 | 0.081 |
| 1306.0 | 0.042 |
| 1305.0 | 0.023 |
| 1304.0 | 0.026 |
| 1303.0 | 0.045 |
| 1302.0 | 0.069 |
| 1301.0 | 0.089 |
| 1300.0 | 0.096 |
| 1299.0 | 0.089 |
| 1298.0 | 0.069 |
| 1297.0 | 0.044 |
| 1296.0 | 0.025 |
| 1295.0 | 0.022 |
| 1294.0 | 0.04 |
| 1293.0 | 0.078 |
| 1292.0 | 0.131 |
| 1291.0 | 0.187 |
| 1290.0 | 0.237 |
| 1289.0 | 0.272 |
| 1288.0 | 0.287 |
| 1287.0 | 0.28 |
| 1286.0 | 0.254 |
| 1285.0 | 0.211 |
| 1284.0 | 0.163 |
| 1283.0 | 0.123 |
| 1282.0 | 0.102 |
| 1281.0 | 0.106 |
| 1280.0 | 0.136 |
| 1279.0 | 0.183 |
| 1278.0 | 0.232 |
| 1277.0 | 0.273 |
| 1276.0 | 0.299 |
| 1275.0 | 0.304 |
| 1274.0 | 0.29 |
| 1273.0 | 0.258 |
| 1272.0 | 0.214 |
| 1271.0 | 0.164 |
| 1270.0 | 0.12 |
| 1269.0 | 0.087 |
| 1268.0 | 0.068 |
| 1267.0 | 0.063 |
| 1266.0 | 0.067 |
| 1265.0 | 0.072 |
| 1264.0 | 0.075 |
| 1263.0 | 0.072 |
| 1262.0 | 0.062 |
| 1261.0 | 0.049 |
| 1260.0 | 0.034 |
| 1259.0 | 0.022 |
| 1258.0 | 0.013 |
| 1257.0 | 0.008 |
| 1256.0 | 0.006 |
| 1255.0 | 0.005 |
| 1254.0 | 0.004 |
| 1253.0 | 0.005 |
| 1252.0 | 0.009 |
| 1251.0 | 0.02 |
| 1250.0 | 0.037 |
| 1249.0 | 0.062 |
| 1248.0 | 0.092 |
| 1247.0 | 0.121 |
| 1246.0 | 0.147 |
| 1245.0 | 0.164 |
| 1244.0 | 0.168 |
| 1243.0 | 0.159 |
| 1242.0 | 0.137 |
| 1241.0 | 0.108 |
| 1240.0 | 0.077 |
| 1239.0 | 0.054 |
| 1238.0 | 0.045 |
| 1237.0 | 0.053 |
| 1236.0 | 0.074 |
| 1235.0 | 0.102 |
| 1234.0 | 0.129 |
| 1233.0 | 0.147 |
| 1232.0 | 0.152 |
| 1231.0 | 0.144 |
| 1230.0 | 0.125 |
| 1229.0 | 0.097 |
| 1228.0 | 0.069 |
| 1227.0 | 0.044 |
| 1226.0 | 0.027 |
| 1225.0 | 0.02 |
| 1224.0 | 0.022 |
| 1223.0 | 0.028 |
| 1222.0 | 0.035 |
| 1221.0 | 0.039 |
| 1220.0 | 0.04 |
| 1219.0 | 0.037 |
| 1218.0 | 0.034 |
| 1217.0 | 0.03 |
| 1216.0 | 0.027 |
| 1215.0 | 0.026 |
| 1214.0 | 0.026 |
| 1213.0 | 0.026 |
| 1212.0 | 0.026 |
| 1211.0 | 0.023 |
| 1210.0 | 0.019 |
| 1209.0 | 0.015 |
| 1208.0 | 0.013 |
| 1207.0 | 0.014 |
| 1206.0 | 0.018 |
| 1205.0 | 0.024 |
| 1204.0 | 0.032 |
| 1203.0 | 0.038 |
| 1202.0 | 0.041 |
| 1201.0 | 0.04 |
| 1200.0 | 0.033 |
| 1199.0 | 0.024 |
| 1198.0 | 0.015 |
| 1197.0 | 0.008 |
| 1196.0 | 0.007 |
| 1195.0 | 0.013 |
| 1194.0 | 0.022 |
| 1193.0 | 0.033 |
| 1192.0 | 0.042 |
| 1191.0 | 0.047 |
| 1190.0 | 0.047 |
| 1189.0 | 0.041 |
| 1188.0 | 0.033 |
| 1187.0 | 0.024 |
| 1186.0 | 0.018 |
| 1185.0 | 0.016 |
| 1184.0 | 0.019 |
| 1183.0 | 0.027 |
| 1182.0 | 0.035 |
| 1181.0 | 0.041 |
| 1180.0 | 0.044 |
| 1179.0 | 0.043 |
| 1178.0 | 0.038 |
| 1177.0 | 0.03 |
| 1176.0 | 0.024 |
| 1175.0 | 0.02 |
| 1174.0 | 0.021 |
| 1173.0 | 0.026 |
| 1172.0 | 0.032 |
| 1171.0 | 0.038 |
| 1170.0 | 0.042 |
| 1169.0 | 0.041 |
| 1168.0 | 0.037 |
| 1167.0 | 0.03 |
| 1166.0 | 0.023 |
| 1165.0 | 0.019 |
| 1164.0 | 0.019 |
| 1163.0 | 0.022 |
| 1162.0 | 0.026 |
| 1161.0 | 0.03 |
| 1160.0 | 0.031 |
| 1159.0 | 0.028 |
| 1158.0 | 0.022 |
| 1157.0 | 0.016 |
| 1156.0 | 0.013 |
| 1155.0 | 0.012 |
| 1154.0 | 0.016 |
| 1153.0 | 0.021 |
| 1152.0 | 0.025 |
| 1151.0 | 0.026 |
| 1150.0 | 0.022 |
| 1149.0 | 0.016 |
| 1148.0 | 0.01 |
| 1147.0 | 0.007 |
| 1146.0 | 0.009 |
| 1145.0 | 0.015 |
| 1144.0 | 0.022 |
| 1143.0 | 0.028 |
| 1142.0 | 0.031 |
| 1141.0 | 0.028 |
| 1140.0 | 0.022 |
| 1139.0 | 0.015 |
| 1138.0 | 0.01 |
| 1137.0 | 0.008 |
| 1136.0 | 0.011 |
| 1135.0 | 0.016 |
| 1134.0 | 0.021 |
| 1133.0 | 0.024 |
| 1132.0 | 0.023 |
| 1131.0 | 0.019 |
| 1130.0 | 0.013 |
| 1129.0 | 0.008 |
| 1128.0 | 0.006 |
| 1127.0 | 0.008 |
| 1126.0 | 0.011 |
| 1125.0 | 0.014 |
| 1124.0 | 0.016 |
| 1123.0 | 0.015 |
| 1122.0 | 0.013 |
| 1121.0 | 0.012 |
| 1120.0 | 0.013 |
| 1119.0 | 0.017 |
| 1118.0 | 0.023 |
| 1117.0 | 0.027 |
| 1116.0 | 0.027 |
| 1115.0 | 0.022 |
| 1114.0 | 0.015 |
| 1113.0 | 0.009 |
| 1112.0 | 0.007 |
| 1111.0 | 0.01 |
| 1110.0 | 0.016 |
| 1109.0 | 0.024 |
| 1108.0 | 0.027 |
| 1107.0 | 0.026 |
| 1106.0 | 0.02 |
| 1105.0 | 0.013 |
| 1104.0 | 0.008 |
| 1103.0 | 0.008 |
| 1102.0 | 0.013 |
| 1101.0 | 0.02 |
| 1100.0 | 0.027 |
| 1099.0 | 0.029 |
| 1098.0 | 0.026 |
| 1097.0 | 0.018 |
| 1096.0 | 0.011 |
| 1095.0 | 0.007 |
| 1094.0 | 0.008 |
| 1093.0 | 0.013 |
| 1092.0 | 0.02 |
| 1091.0 | 0.024 |
| 1090.0 | 0.023 |
| 1089.0 | 0.018 |
| 1088.0 | 0.012 |
| 1087.0 | 0.007 |
| 1086.0 | 0.008 |
| 1085.0 | 0.015 |
| 1084.0 | 0.025 |
| 1083.0 | 0.034 |
| 1082.0 | 0.038 |
| 1081.0 | 0.035 |
| 1080.0 | 0.026 |
| 1079.0 | 0.016 |
| 1078.0 | 0.009 |
| 1077.0 | 0.007 |
| 1076.0 | 0.009 |
| 1075.0 | 0.015 |
| 1074.0 | 0.02 |
| 1073.0 | 0.021 |
| 1072.0 | 0.02 |
| 1071.0 | 0.015 |
| 1070.0 | 0.011 |
| 1069.0 | 0.008 |
| 1068.0 | 0.007 |
| 1067.0 | 0.008 |
| 1066.0 | 0.008 |
| 1065.0 | 0.008 |
| 1064.0 | 0.007 |
| 1063.0 | 0.005 |
| 1062.0 | 0.004 |
| 1061.0 | 0.003 |
| 1060.0 | 0.003 |
| 1059.0 | 0.003 |
| 1058.0 | 0.004 |
| 1057.0 | 0.004 |
| 1056.0 | 0.004 |
| 1055.0 | 0.004 |
| 1054.0 | 0.004 |
| 1053.0 | 0.004 |
| 1052.0 | 0.003 |
| 1051.0 | 0.003 |
| 1050.0 | 0.003 |
| 1049.0 | 0.003 |
| 1048.0 | 0.002 |
| 1047.0 | 0.002 |
| 1046.0 | 0.002 |
| 1045.0 | 0.002 |
| 1044.0 | 0.002 |
| 1043.0 | 0.003 |
| 1042.0 | 0.003 |
| 1041.0 | 0.003 |
| 1040.0 | 0.001 |
| 1039.0 | 0.004 |
| 1038.0 | 0.001 |
| 1037.0 | 0.036 |
| 1036.0 | 0.041 |
| 1035.0 | 0.003 |
| 1034.0 | 0.009 |
| 1033.0 | 0.008 |
| 1032.0 | 0.009 |
| 1031.0 | 0.013 |
| 1030.0 | 0.027 |
| 1029.0 | 0.03 |
| 1028.0 | 0.034 |
| 1027.0 | 0 |
| 1026.0 | 0.016 |
| 1025.0 | 0.008 |
| 1024.0 | 0.008 |
| 1023.0 | 0.022 |
| 1022.0 | 0.029 |
| 1021.0 | 0.024 |
| 1020.0 | 0.006 |
| 1019.0 | 0.009 |
| 1018.0 | 0.009 |
| 1017.0 | 0.008 |
| 1016.0 | 0.02 |
| 1015.0 | 0.022 |
| 1014.0 | 0.005 |
| 1013.0 | 0.008 |
| 1012.0 | 0.005 |
| 1011.0 | 0.004 |
| 1010.0 | 0.019 |
| 1009.0 | 0.024 |
| 1008.0 | 0 |
| 1007.0 | 0.005 |
| 1006.0 | 0.01 |
| 1005.0 | 0.011 |
| 1004.0 | 0.022 |
| 1003.0 | 0.023 |
| 1002.0 | 0.002 |
| 1001.0 | 0.006 |
| 1000.0 | 0.003 |
| 999.0 | 0.019 |
| 998.0 | 0.026 |
| 997.0 | 0.003 |
| 996.0 | 0.014 |
| 995.0 | 0.001 |
| 994.0 | 0.021 |
| 993.0 | 0.024 |
| 992.0 | 0.004 |
| 991.0 | 0.015 |
| 990.0 | 0.009 |
| 989.0 | 0.017 |
| 988.0 | 0.03 |
| 987.0 | 0.001 |
| 986.0 | 0.006 |
| 985.0 | 0.004 |
| 984.0 | 0.019 |
| 983.0 | 0.003 |
| 982.0 | 0.007 |
| 981.0 | 0 |
| 980.0 | 0.018 |
| 979.0 | 0.003 |
| 978.0 | 0.001 |
| 977.0 | 0.023 |
| 976.0 | 0.03 |
| 975.0 | 0 |
| 974.0 | 0.005 |
| 973.0 | 0.015 |
| 972.0 | 0.003 |
| 971.0 | 0.009 |
| 970.0 | 0.005 |
| 969.0 | 0.018 |
| 968.0 | 0.004 |
| 967.0 | 0.003 |
| 966.0 | 0.006 |
| 965.0 | 0.008 |
| 964.0 | 0.003 |
| 963.0 | 0.023 |
| 962.0 | 0.004 |
| 961.0 | 0.02 |
| 960.0 | 0.002 |
| 959.0 | 0.03 |
| 958.0 | 0.031 |
| 957.0 | 0 |
| 956.0 | 0.018 |
| 955.0 | 0 |
| 954.0 | 0.031 |
| 953.0 | 0.034 |
| 952.0 | 0.003 |
| 951.0 | 0.028 |
| 950.0 | 0.004 |
| 949.0 | 0.029 |
| 948.0 | 0.032 |
| 947.0 | 0.001 |
| 946.0 | 0.012 |
| 945.0 | 0.001 |
| 944.0 | 0.022 |
| 943.0 | 0.011 |
| 942.0 | 0.001 |
| 941.0 | 0.011 |
| 940.0 | 0.025 |
| 939.0 | 0.001 |
| 938.0 | 0.02 |
| 937.0 | 0.005 |
| 936.0 | 0.016 |
| 935.0 | 0.003 |
| 934.0 | 0.003 |
| 933.0 | 0.009 |
| 932.0 | 0.032 |
| 931.0 | 0.026 |
| 930.0 | 0.005 |
| 929.0 | 0.026 |
| 928.0 | 0.011 |
| 927.0 | 0.007 |
| 926.0 | 0.017 |
| 925.0 | 0.003 |
| 924.0 | 0.012 |
| 923.0 | 0.003 |
| 922.0 | 0.029 |
| 921.0 | 0.029 |
| 920.0 | 0.001 |
| 919.0 | 0.016 |
| 918.0 | 0.001 |
| 917.0 | 0.004 |
| 916.0 | 0.007 |
| 915.0 | 0.02 |
| 914.0 | 0.009 |
| 913.0 | 0.01 |
| 912.0 | 0.005 |
| 911.0 | 0.01 |
| 910.0 | 0.004 |
| 909.0 | 0.011 |
| 908.0 | 0.022 |
| 907.0 | 0.01 |
| 906.0 | 0.004 |
| 905.0 | 0.006 |
| 904.0 | 0.002 |
| 903.0 | 0 |
| 902.0 | 0.002 |
| 901.0 | 0.017 |
| 900.0 | 0.027 |
| 899.0 | 0.006 |
| 898.0 | 0.018 |
| 897.0 | 0.011 |
| 896.0 | 0.017 |
| 895.0 | 0.013 |
| 894.0 | 0.003 |
| 893.0 | 0.011 |
| 892.0 | 0.006 |
| 891.0 | 0.007 |
| 890.0 | 0.021 |
| 889.0 | 0.017 |
| 888.0 | 0.009 |
| 887.0 | 0.006 |
| 886.0 | 0.011 |
| 885.0 | 0.011 |
| 884.0 | 0.004 |
| 883.0 | 0.005 |
| 882.0 | 0.006 |
| 881.0 | 0.007 |
| 880.0 | 0.01 |
| 879.0 | 0.013 |
| 878.0 | 0.011 |
| 877.0 | 0.003 |
| 876.0 | 0.002 |
| 875.0 | 0.008 |
| 874.0 | 0.007 |
| 873.0 | 0 |
| 872.0 | 0.006 |
| 871.0 | 0.012 |
| 870.0 | 0.017 |
| 869.0 | 0.021 |
| 868.0 | 0.015 |
| 867.0 | 0.006 |
| 866.0 | 0 |
| 865.0 | 0.002 |
| 864.0 | 0.011 |
| 863.0 | 0.012 |
| 862.0 | 0.003 |
| 861.0 | 0.002 |
| 860.0 | 0.002 |
| 859.0 | 0.001 |
| 858.0 | 0.005 |
| 857.0 | 0.006 |
| 856.0 | 0.005 |
| 855.0 | 0.005 |
| 854.0 | 0.006 |
| 853.0 | 0.004 |
| 852.0 | 0.004 |
| 851.0 | 0.004 |
| 850.0 | 0.003 |
| 849.0 | 0.004 |
| 848.0 | 0.003 |
| 847.0 | 0.002 |
| 846.0 | 0.007 |
| 845.0 | 0.008 |
| 844.0 | 0.006 |
| 843.0 | 0.007 |
| 842.0 | 0.009 |
| 841.0 | 0.007 |
| 840.0 | 0.004 |
| 839.0 | 0.007 |
| 838.0 | 0.008 |
| 837.0 | 0.005 |
| 836.0 | 0.004 |
| 835.0 | 0.008 |
| 834.0 | 0.01 |
| 833.0 | 0.01 |
| 832.0 | 0.011 |
| 831.0 | 0.011 |
| 830.0 | 0.009 |
| 829.0 | 0.006 |
| 828.0 | 0.007 |
| 827.0 | 0.006 |
| 826.0 | 0.006 |
| 825.0 | 0.006 |
| 824.0 | 0.008 |
| 823.0 | 0.009 |
| 822.0 | 0.009 |
| 821.0 | 0.005 |
| 820.0 | 0.007 |
| 819.0 | 0.01 |
| 818.0 | 0.009 |
| 817.0 | 0.006 |
| 816.0 | 0.01 |
| 815.0 | 0.011 |
| 814.0 | 0.009 |
| 813.0 | 0.007 |
| 812.0 | 0.006 |
| 811.0 | 0.005 |
| 810.0 | 0.005 |
| 809.0 | 0.006 |
| 808.0 | 0.006 |
| 807.0 | 0.005 |
| 806.0 | 0.004 |
| 805.0 | 0.005 |
| 804.0 | 0.009 |
| 803.0 | 0.013 |
| 802.0 | 0.088 |
| 801.0 | 0.402 |
| 800.0 | 1.064 |
| 799.0 | 2.123 |
| 798.0 | 3.224 |
| 797.0 | 4.514 |
| 796.0 | 5.225 |
| 795.0 | 5.663 |
| 794.0 | 5.807 |
| 793.0 | 5.869 |
| 792.0 | 5.857 |
| 791.0 | 5.832 |
| 790.0 | 5.885 |
| 789.0 | 6.003 |
| 788.0 | 6.034 |
| 787.0 | 6.001 |
| 786.0 | 6.003 |
| 785.0 | 6.026 |
| 784.0 | 6.044 |
| 783.0 | 6.076 |
| 782.0 | 6.092 |
| 781.0 | 6.055 |
| 780.0 | 6.098 |
| 779.0 | 6.03 |
| 778.0 | 5.906 |
| 777.0 | 5.662 |
| 776.0 | 4.931 |
| 775.0 | 4.146 |
| 774.0 | 2.704 |
| 773.0 | 1.311 |
| 772.0 | 0.482 |
| 771.0 | 0.147 |
| 770.0 | 0.043 |
| 769.0 | 0.016 |
| 768.0 | 0.007 |
| 767.0 | 0.005 |
| 766.0 | 0.005 |
| 765.0 | 0.007 |
| 764.0 | 0.007 |
| 763.0 | 0.006 |
| 762.0 | 0.005 |
| 761.0 | 0.007 |
| 760.0 | 0.011 |
| 759.0 | 0.011 |
| 758.0 | 0.008 |
| 757.0 | 0.011 |
| 756.0 | 0.01 |
| 755.0 | 0.007 |
| 754.0 | 0.007 |
| 753.0 | 0.008 |
| 752.0 | 0.007 |
| 751.0 | 0.008 |
| 750.0 | 0.009 |
| 749.0 | 0.009 |
| 748.0 | 0.007 |
| 747.0 | 0.008 |
| 746.0 | 0.007 |
| 745.0 | 0.008 |
| 744.0 | 0.007 |
| 743.0 | 0.009 |
| 742.0 | 0.008 |
| 741.0 | 0.007 |
| 740.0 | 0.009 |
| 739.0 | 0.007 |
| 738.0 | 0.006 |
| 737.0 | 0.008 |
| 736.0 | 0.007 |
| 735.0 | 0.008 |
| 734.0 | 0.004 |
| 733.0 | 0.007 |
| 732.0 | 0.003 |
| 731.0 | 0.004 |
| 730.0 | 0.009 |
| 729.0 | 0.008 |
| 728.0 | 0.006 |
| 727.0 | 0.006 |
| 726.0 | 0.006 |
| 725.0 | 0.007 |
| 724.0 | 0.007 |
| 723.0 | 0.006 |
| 722.0 | 0.006 |
| 721.0 | 0.008 |
| 720.0 | 0.005 |
| 719.0 | 0.003 |
| 718.0 | 0.003 |
| 717.0 | 0.003 |
| 716.0 | 0.002 |
| 715.0 | 0.004 |
| 714.0 | 0.001 |
| 713.0 | 0.003 |
| 712.0 | 0.002 |
| 711.0 | 0.004 |
| 710.0 | 0.004 |
| 709.0 | 0.004 |
| 708.0 | 0.004 |
| 707.0 | 0.005 |
| 706.0 | 0.002 |
| 705.0 | 0.006 |
| 704.0 | 0.004 |
| 703.0 | 0.004 |
| 702.0 | 0.004 |
| 701.0 | 0.003 |
| 700.0 | 0.006 |
| 699.0 | 0.004 |
| 698.0 | 0.005 |
| 697.0 | 0.006 |
| 696.0 | 0.007 |
| 695.0 | 0.006 |
| 694.0 | 0.008 |
| 693.0 | 0.007 |
| 692.0 | 0.008 |
| 691.0 | 0.007 |
| 690.0 | 0.005 |
| 689.0 | 0.007 |
| 688.0 | 0.008 |
| 687.0 | 0.009 |
| 686.0 | 0.005 |
| 685.0 | 0.008 |
| 684.0 | 0.007 |
| 683.0 | 0.008 |
| 682.0 | 0.008 |
| 681.0 | 0.006 |
| 680.0 | 0.007 |
| 679.0 | 0.008 |
| 678.0 | 0.007 |
| 677.0 | 0.008 |
| 676.0 | 0.007 |
| 675.0 | 0.006 |
| 674.0 | 0.007 |
| 673.0 | 0.007 |
| 672.0 | 0.008 |
| 671.0 | 0.009 |
| 670.0 | 0.009 |
| 669.0 | 0.008 |
| 668.0 | 0.009 |
| 667.0 | 0.011 |
| 666.0 | 0.008 |
| 665.0 | 0.005 |
| 664.0 | 0.01 |
| 663.0 | 0.006 |
| 662.0 | 0.005 |
| 661.0 | 0.005 |
| 660.0 | 0.005 |
| 659.0 | 0.006 |
| 658.0 | 0.005 |
| 657.0 | 0.005 |
| 656.0 | 0.005 |
| 655.0 | 0.005 |
| 654.0 | 0.007 |
| 653.0 | 0.006 |
| 652.0 | 0.006 |
| 651.0 | 0.005 |
| 650.0 | 0.004 |
| 649.0 | 0.007 |
| 648.0 | 0.006 |
| 647.0 | 0.005 |
| 646.0 | 0.006 |
| 645.0 | 0.005 |
| 644.0 | 0.004 |
| 643.0 | 0.005 |
| 642.0 | 0.005 |
| 641.0 | 0.004 |
| 640.0 | 0.003 |
| 639.0 | 0.002 |
| 638.0 | 0.005 |
| 637.0 | 0.005 |
| 636.0 | 0.003 |
| 635.0 | 0.005 |
| 634.0 | 0.005 |
| 633.0 | 0.006 |
| 632.0 | 0.006 |
| 631.0 | 0.008 |
| 630.0 | 0.003 |
| 629.0 | 0.005 |
| 628.0 | 0.005 |
| 627.0 | 0.004 |
| 626.0 | 0.005 |
| 625.0 | 0.004 |
| 624.0 | 0.004 |
| 623.0 | 0.006 |
| 622.0 | 0.004 |
| 621.0 | 0.005 |
| 620.0 | 0.003 |
| 619.0 | 0.003 |
| 618.0 | 0.006 |
| 617.0 | 0.007 |
| 616.0 | 0.006 |
| 615.0 | 0.007 |
| 614.0 | 0.005 |
| 613.0 | 0.005 |
| 612.0 | 0.004 |
| 611.0 | 0.004 |
| 610.0 | 0.005 |
| 609.0 | 0.004 |
| 608.0 | 0.002 |
| 607.0 | 0.001 |
| 606.0 | 0.001 |
| 605.0 | 0.003 |
| 604.0 | 0.001 |
| 603.0 | 0.001 |
| 602.0 | 0 |
| 601.0 | 0.001 |
| 600.0 | 0.002 |
| 599.0 | 0.001 |
| 598.0 | 0.001 |
| 597.0 | 0.002 |
| 596.0 | 0.001 |
| 595.0 | 0.003 |
| 594.0 | 0 |
| 593.0 | 0.001 |
| 592.0 | 0 |
| 591.0 | 0.002 |
| 590.0 | 0.004 |
| 589.0 | 0.007 |
| 588.0 | 0.007 |
| 587.0 | 0.007 |
| 586.0 | 0.007 |
| 585.0 | 0.007 |
| 584.0 | 0.008 |
| 583.0 | 0.008 |
| 582.0 | 0.01 |
| 581.0 | 0.021 |
| 580.0 | 0.052 |
| 579.0 | 0.08 |
| 578.0 | 0.09 |
| 577.0 | 0.104 |
| 576.0 | 0.13 |
| 575.0 | 0.154 |
| 574.0 | 0.177 |
| 573.0 | 0.234 |
| 572.0 | 0.299 |
| 571.0 | 0.339 |
| 570.0 | 0.355 |
| 569.0 | 0.349 |
| 568.0 | 0.352 |
| 567.0 | 0.352 |
| 566.0 | 0.343 |
| 565.0 | 0.339 |
| 564.0 | 0.354 |
| 563.0 | 0.403 |
| 562.0 | 0.494 |
| 561.0 | 0.592 |
| 560.0 | 0.66 |
| 559.0 | 0.741 |
| 558.0 | 0.813 |
| 557.0 | 0.822 |
| 556.0 | 0.826 |
| 555.0 | 0.887 |
| 554.0 | 0.993 |
| 553.0 | 1.104 |
| 552.0 | 1.175 |
| 551.0 | 1.207 |
| 550.0 | 1.262 |
| 549.0 | 1.365 |
| 548.0 | 1.5 |
| 547.0 | 1.639 |
| 546.0 | 1.701 |
| 545.0 | 1.753 |
| 544.0 | 1.925 |
| 543.0 | 2.17 |
| 542.0 | 2.342 |
| 541.0 | 2.505 |
| 540.0 | 2.784 |
| 539.0 | 3.221 |
| 538.0 | 3.754 |
| 537.0 | 5.009 |
| 536.0 | 4.33 |
| 535.0 | 4.282 |
| 534.0 | 4.472 |
| 533.0 | 4.362 |
| 532.0 | 4.817 |
| 531.0 | 4.548 |
| 530.0 | 4.256 |
| 529.0 | 4.255 |
| 528.0 | 4.273 |
| 527.0 | 4.472 |
| 526.0 | 4.884 |
| 525.0 | 4.444 |
| 524.0 | 4.238 |
| 523.0 | 4.246 |
| 522.0 | 4.23 |
| 521.0 | 4.406 |
| 520.0 | 4.758 |
| 519.0 | 4.582 |
| 518.0 | 4.214 |
| 517.0 | 4.23 |
| 516.0 | 4.246 |
| 515.0 | 4.382 |
| 514.0 | 4.786 |
| 513.0 | 4.499 |
| 512.0 | 4.237 |
| 511.0 | 4.289 |
| 510.0 | 4.299 |
| 509.0 | 4.499 |
| 508.0 | 4.785 |
| 507.0 | 4.53 |
| 506.0 | 4.289 |
| 505.0 | 4.28 |
| 504.0 | 4.289 |
| 503.0 | 4.484 |
| 502.0 | 4.682 |
| 501.0 | 4.456 |
| 500.0 | 4.228 |
| 499.0 | 4.417 |
| 498.0 | 4.417 |
| 497.0 | 4.429 |
| 496.0 | 4.881 |
| 495.0 | 4.442 |
| 494.0 | 4.19 |
| 493.0 | 4.22 |
| 492.0 | 4.298 |
| 491.0 | 4.469 |
| 490.0 | 4.881 |
| 489.0 | 4.545 |
| 488.0 | 4.279 |
| 487.0 | 4.261 |
| 486.0 | 4.297 |
| 485.0 | 4.513 |
| 484.0 | 4.784 |
| 483.0 | 4.416 |
| 482.0 | 4.227 |
| 481.0 | 4.219 |
| 480.0 | 4.227 |
| 479.0 | 4.428 |
| 478.0 | 4.704 |
| 477.0 | 4.403 |
| 476.0 | 4.188 |
| 475.0 | 4.335 |
| 474.0 | 4.414 |
| 473.0 | 4.39 |
| 472.0 | 4.561 |
| 471.0 | 4.346 |
| 470.0 | 4.187 |
| 469.0 | 4.324 |
| 468.0 | 4.414 |
| 467.0 | 4.495 |
| 466.0 | 4.679 |
| 465.0 | 4.377 |
| 464.0 | 4.225 |
| 463.0 | 4.217 |
| 462.0 | 4.225 |
| 461.0 | 4.377 |
| 460.0 | 4.656 |
| 459.0 | 4.451 |
| 458.0 | 4.216 |
| 457.0 | 4.248 |
| 456.0 | 4.343 |
| 455.0 | 4.558 |
| 454.0 | 5.001 |
| 453.0 | 4.451 |
| 452.0 | 4.215 |
| 451.0 | 4.239 |
| 450.0 | 4.283 |
| 449.0 | 4.478 |
| 448.0 | 4.724 |
| 447.0 | 4.375 |
| 446.0 | 4.23 |
| 445.0 | 4.311 |
| 444.0 | 4.331 |
| 443.0 | 4.492 |
| 442.0 | 4.724 |
| 441.0 | 4.386 |
| 440.0 | 4.246 |
| 439.0 | 4.409 |
| 438.0 | 4.362 |
| 437.0 | 4.491 |
| 436.0 | 4.839 |
| 435.0 | 4.396 |
| 434.0 | 4.299 |
| 433.0 | 4.253 |
| 432.0 | 4.289 |
| 431.0 | 4.49 |
| 430.0 | 4.838 |
| 429.0 | 4.384 |
| 428.0 | 4.298 |
| 427.0 | 4.328 |
| 426.0 | 4.36 |
| 425.0 | 4.474 |
| 424.0 | 4.72 |
| 423.0 | 4.371 |
| 422.0 | 4.288 |
| 421.0 | 4.218 |
| 420.0 | 4.306 |
| 419.0 | 4.671 |
| 418.0 | 5.171 |
| 417.0 | 4.359 |
| 416.0 | 4.201 |
| 415.0 | 4.25 |
| 414.0 | 4.336 |
| 413.0 | 4.569 |
| 412.0 | 5.046 |
| 411.0 | 4.336 |
| 410.0 | 4.305 |
| 409.0 | 4.335 |
| 408.0 | 4.285 |
| 407.0 | 4.625 |
| 406.0 | 4.834 |
| 405.0 | 4.368 |
| 404.0 | 4.275 |
| 403.0 | 4.428 |
| 402.0 | 4.356 |
| 401.0 | 4.585 |
| 400.0 | 4.8 |
| 399.0 | 4.323 |
| 398.0 | 4.23 |
| 397.0 | 4.454 |
| 396.0 | 4.283 |
| 395.0 | 4.603 |
| 394.0 | 4.715 |
| 393.0 | 4.332 |
| 392.0 | 4.254 |
| 391.0 | 4.272 |
| 390.0 | 4.245 |
| 389.0 | 4.83 |
| 388.0 | 4.564 |
| 387.0 | 3.923 |
| 386.0 | 3.676 |
| 385.0 | 3.332 |
| 384.0 | 2.383 |
| 383.0 | 1.883 |
| 382.0 | 1.741 |
| 381.0 | 1.934 |
| 380.0 | 2.445 |
| 379.0 | 2.981 |
| 378.0 | 3.194 |
| 377.0 | 3.4 |
| 376.0 | 3.7 |
| 375.0 | 3.919 |
| 374.0 | 3.694 |
| 373.0 | 3.333 |
| 372.0 | 2.992 |
| 371.0 | 2.774 |
| 370.0 | 2.777 |
| 369.0 | 3.015 |
| 368.0 | 3.394 |
| 367.0 | 3.517 |
| 366.0 | 3.262 |
| 365.0 | 2.792 |
| 364.0 | 2.523 |
| 363.0 | 2.427 |
| 362.0 | 2.454 |
| 361.0 | 2.62 |
| 360.0 | 2.994 |
| 359.0 | 3.52 |
| 358.0 | 3.816 |
| 357.0 | 3.787 |
| 356.0 | 3.887 |
| 355.0 | 3.849 |
| 354.0 | 4.129 |
| 353.0 | 4.613 |
| 352.0 | 4.504 |
| 351.0 | 4.893 |
| 350.0 | 4.322 |
| 349.0 | 5.032 |
| 348.0 | 4.855 |
| 347.0 | 4.633 |
| 346.0 | 4.244 |
| 345.0 | 4.632 |
| 344.0 | 4.252 |
| 343.0 | 4.591 |
| 342.0 | 4.703 |
| 341.0 | 4.401 |
| 340.0 | 4.289 |
| 339.0 | 4.818 |
| 338.0 | 4.299 |
| 337.0 | 5.233 |
| 336.0 | 4.932 |
| 335.0 | 4.57 |
| 334.0 | 4.25 |
| 333.0 | 4.484 |
| 332.0 | 4.329 |
| 331.0 | 4.755 |
| 330.0 | 5.027 |
| 329.0 | 4.328 |
| 328.0 | 4.223 |
| 327.0 | 4.515 |
| 326.0 | 4.317 |
| 325.0 | 4.725 |
| 324.0 | 4.783 |
| 323.0 | 4.306 |
| 322.0 | 4.338 |
| 321.0 | 4.497 |
| 320.0 | 4.327 |
| 319.0 | 4.627 |
| 318.0 | 4.272 |
| 317.0 | 4.292 |
| 316.0 | 4.253 |
| 315.0 | 4.846 |
| 314.0 | 4.345 |
| 313.0 | 5.146 |
| 312.0 | 4.97 |
| 311.0 | 4.392 |
| 310.0 | 4.153 |
| 309.0 | 5.078 |
| 308.0 | 4.28 |
| 307.0 | 4.923 |
| 306.0 | 4.58 |
| 305.0 | 4.391 |
| 304.0 | 4.182 |
| 303.0 | 4.377 |
| 302.0 | 4.33 |
| 301.0 | 5.921 |
| 300.0 | 4.775 |
| 299.0 | 4.376 |
| 298.0 | 4.157 |
| 297.0 | 4.473 |
| 296.0 | 4.286 |
| 295.0 | 5.318 |
| 294.0 | 4.773 |
| 293.0 | 4.306 |
| 292.0 | 4.256 |
| 291.0 | 4.275 |
| 290.0 | 4.285 |
| 289.0 | 5.316 |
| 288.0 | 4.963 |
| 287.0 | 4.305 |
| 286.0 | 4.185 |
| 285.0 | 4.962 |
| 284.0 | 4.263 |
| 283.0 | 4.962 |
| 282.0 | 4.875 |
| 281.0 | 4.293 |
| 280.0 | 4.262 |
| 279.0 | 4.302 |
| 278.0 | 4.324 |
| 277.0 | 4.836 |
| 276.0 | 4.71 |
| 275.0 | 4.261 |
| 274.0 | 4.251 |
| 273.0 | 4.27 |
| 272.0 | 4.312 |
| 271.0 | 4.683 |
| 270.0 | 5.01 |
| 269.0 | 4.181 |
| 268.0 | 4.26 |
| 267.0 | 4.533 |
| 266.0 | 4.799 |
| 265.0 | 4.682 |
| 264.0 | 4.958 |
| 263.0 | 4.25 |
| 262.0 | 4.332 |
| 261.0 | 4.589 |
| 260.0 | 4.299 |
| 259.0 | 4.589 |
| 258.0 | 5.066 |
| 257.0 | 4.212 |
| 256.0 | 4.366 |
| 255.0 | 4.609 |
| 254.0 | 4.319 |
| 253.0 | 4.608 |
| 252.0 | 4.511 |
| 251.0 | 4.123 |
| 250.0 | 4.255 |
| 249.0 | 4.209 |
| 248.0 | 4.328 |
| 247.0 | 4.652 |
| 246.0 | 4.652 |
| 245.0 | 4.226 |
| 244.0 | 4.294 |
| 243.0 | 4.827 |
| 242.0 | 4.304 |
| 241.0 | 4.793 |
| 240.0 | 5.208 |
| 239.0 | 4.199 |
| 238.0 | 4.253 |
| 237.0 | 4.216 |
| 236.0 | 4.375 |
| 235.0 | 4.866 |
| 234.0 | 4.628 |
| 233.0 | 4.182 |
| 232.0 | 4.263 |
| 231.0 | 4.65 |
| 230.0 | 4.206 |
| 229.0 | 4.791 |
| 228.0 | 4.543 |
| 227.0 | 4.26 |
| 226.0 | 4.187 |
| 225.0 | 4.397 |
| 224.0 | 4.22 |
| 223.0 | 4.645 |
| 222.0 | 4.599 |
| 221.0 | 4.297 |
| 220.0 | 4.174 |
| 219.0 | 4.555 |
| 218.0 | 4.189 |
| 217.0 | 4.781 |
| 216.0 | 4.418 |
| 215.0 | 4.25 |
| 214.0 | 4.122 |
| 213.0 | 4.55 |
| 212.0 | 4.21 |
| 211.0 | 4.635 |
| 210.0 | 4.427 |
| 209.0 | 4.245 |
| 208.0 | 4.089 |
| 207.0 | 4.244 |
| 206.0 | 4.17 |
| 205.0 | 4.454 |
| 204.0 | 4.272 |
| 203.0 | 4.099 |
| 202.0 | 4.02 |
| 201.0 | 3.953 |
| 200.0 | 3.947 |